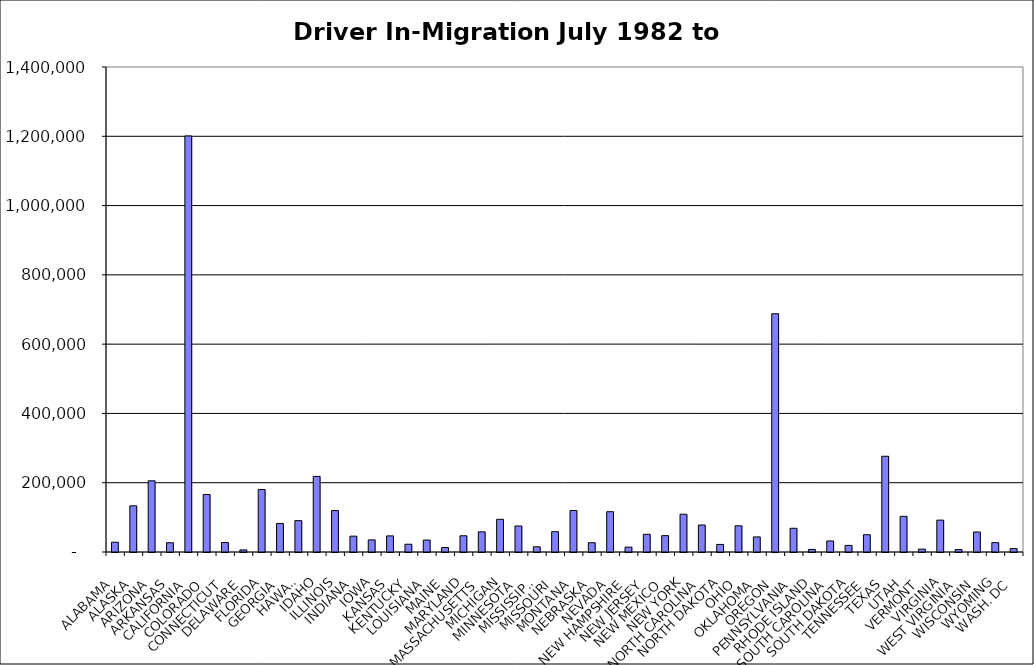
| Category | Series 0 |
|---|---|
| ALABAMA | 28308.5 |
| ALASKA | 133275.5 |
| ARIZONA | 205530 |
| ARKANSAS | 26748.5 |
| CALIFORNIA | 1201031.5 |
| COLORADO | 165968 |
| CONNECTICUT | 27376 |
| DELAWARE | 6052.5 |
| FLORIDA | 180510 |
| GEORGIA | 82469 |
| HAWAII | 90522.5 |
| IDAHO | 218215.5 |
| ILLINOIS | 119580.5 |
| INDIANA | 45758 |
| IOWA | 34921.5 |
| KANSAS | 46537.5 |
| KENTUCKY | 22377 |
| LOUISIANA | 34421.5 |
| MAINE | 12979.5 |
| MARYLAND | 46847 |
| MASSACHUSETTS | 58167 |
| MICHIGAN | 94368 |
| MINNESOTA | 75138.5 |
| MISSISSIPPI | 14975 |
| MISSOURI | 58562 |
| MONTANA | 119691 |
| NEBRASKA | 26752.5 |
| NEVADA | 116286 |
| NEW HAMPSHIRE | 14122.5 |
| NEW JERSEY | 51013 |
| NEW MEXICO | 47184 |
| NEW YORK | 108987 |
| NORTH CAROLINA | 77911.5 |
| NORTH DAKOTA | 21889.5 |
| OHIO | 75566.5 |
| OKLAHOMA | 43499 |
| OREGON | 687754 |
| PENNSYLVANIA | 68473.5 |
| RHODE ISLAND | 7434 |
| SOUTH CAROLINA | 31870.5 |
| SOUTH DAKOTA | 19024.5 |
| TENNESSEE | 49856.5 |
| TEXAS | 276361 |
| UTAH | 102879.5 |
| VERMONT | 8288 |
| VIRGINIA | 91985 |
| WEST VIRGINIA | 7002.5 |
| WISCONSIN | 57744.5 |
| WYOMING | 26927 |
| WASH. DC | 9763 |